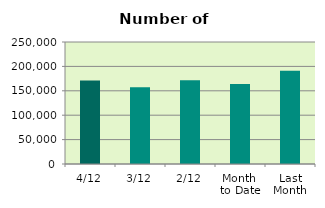
| Category | Series 0 |
|---|---|
| 4/12 | 171082 |
| 3/12 | 157462 |
| 2/12 | 171432 |
| Month 
to Date | 163947 |
| Last
Month | 191084.095 |